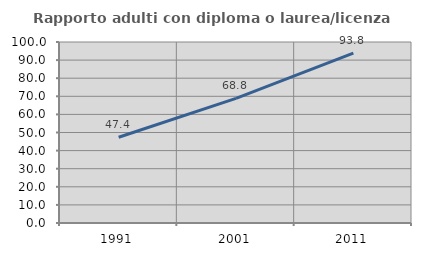
| Category | Rapporto adulti con diploma o laurea/licenza media  |
|---|---|
| 1991.0 | 47.368 |
| 2001.0 | 68.817 |
| 2011.0 | 93.805 |